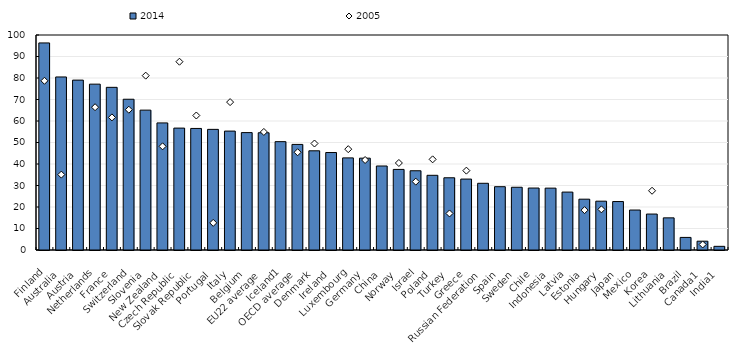
| Category | 2014 |
|---|---|
| Finland | 96.315 |
| Australia | 80.486 |
| Austria | 79.017 |
| Netherlands | 77.143 |
| France | 75.661 |
| Switzerland | 70.118 |
| Slovenia | 65.052 |
| New Zealand | 59.111 |
| Czech Republic | 56.698 |
| Slovak Republic | 56.534 |
| Portugal | 56.11 |
| Italy | 55.312 |
| Belgium | 54.602 |
| EU22 average | 54.541 |
| Iceland1 | 50.396 |
| OECD average | 49.106 |
| Denmark | 46.135 |
| Ireland | 45.334 |
| Luxembourg | 42.844 |
| Germany | 42.717 |
| China | 39.07 |
| Norway | 37.483 |
| Israel | 36.855 |
| Poland | 34.743 |
| Turkey | 33.597 |
| Greece | 32.991 |
| Russian Federation | 31.026 |
| Spain | 29.443 |
| Sweden | 29.184 |
| Chile | 28.82 |
| Indonesia | 28.778 |
| Latvia | 26.934 |
| Estonia | 23.635 |
| Hungary | 22.704 |
| Japan | 22.543 |
| Mexico | 18.585 |
| Korea | 16.719 |
| Lithuania | 14.953 |
| Brazil | 5.85 |
| Canada1 | 4.095 |
| India1 | 1.705 |